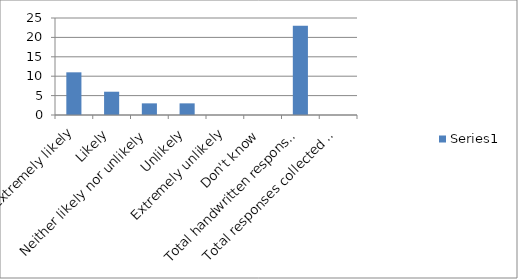
| Category | Series 0 |
|---|---|
| Extremely likely | 11 |
| Likely | 6 |
| Neither likely nor unlikely | 3 |
| Unlikely | 3 |
| Extremely unlikely | 0 |
| Don't know | 0 |
| Total handwritten responses | 23 |
| Total responses collected from other methods | 0 |